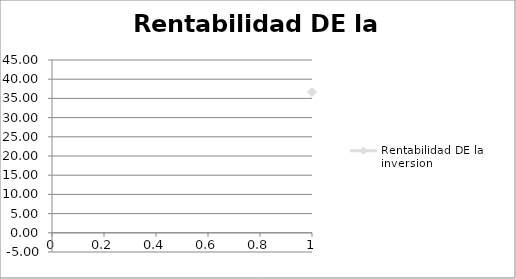
| Category | Rentabilidad DE la inversion |
|---|---|
| 0 | 36.658 |
| 1 | 27.264 |
| 2 | 36.983 |
| 3 | 37.973 |
| 4 | 37.388 |
| 5 | 37.049 |
| 6 | 0.371 |
| 7 | 0.378 |